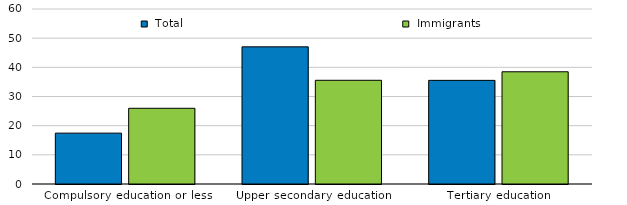
| Category |  Total |  Immigrants |
|---|---|---|
| Compulsory education or less | 17.44 | 25.96 |
| Upper secondary education | 47.03 | 35.56 |
| Tertiary education | 35.53 | 38.48 |